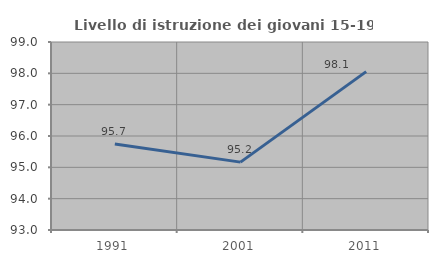
| Category | Livello di istruzione dei giovani 15-19 anni |
|---|---|
| 1991.0 | 95.745 |
| 2001.0 | 95.166 |
| 2011.0 | 98.054 |